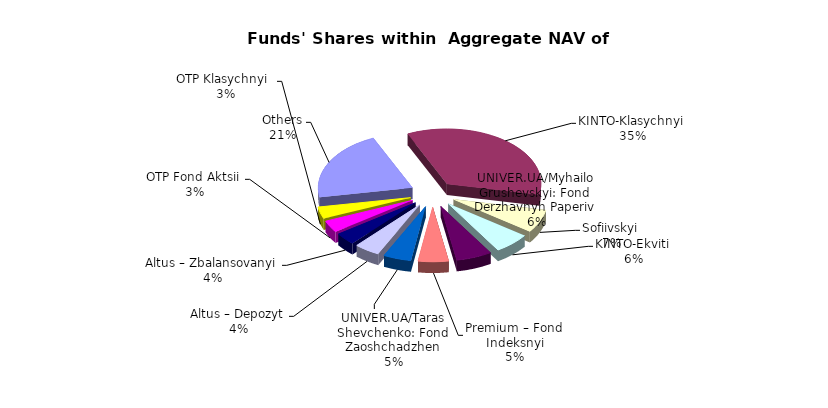
| Category | Series 0 | Series 1 |
|---|---|---|
| Others | 13035524.09 | 0.209 |
| KINTO-Klasychnyi | 21760492.91 | 0.35 |
| Sofiivskyi | 4241285.8 | 0.068 |
| KINTO-Ekviti | 3841421.14 | 0.062 |
| UNIVER.UA/Myhailo Grushevskyi: Fond Derzhavnyh Paperiv | 3819955.48 | 0.061 |
| Premium – Fond Indeksnyi | 3256880.184 | 0.052 |
| UNIVER.UA/Taras Shevchenko: Fond Zaoshchadzhen | 2979664.94 | 0.048 |
| Altus – Depozyt | 2728512.17 | 0.044 |
| Altus – Zbalansovanyi | 2229011.42 | 0.036 |
| OTP Fond Aktsii | 2168145.06 | 0.035 |
| OTP Klasychnyi  | 2163394.76 | 0.035 |